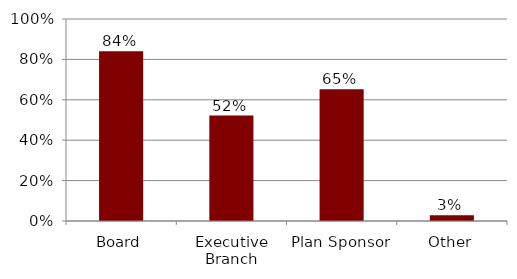
| Category | Series 0 |
|---|---|
| Board | 0.841 |
| Executive Branch | 0.522 |
| Plan Sponsor | 0.652 |
| Other | 0.029 |